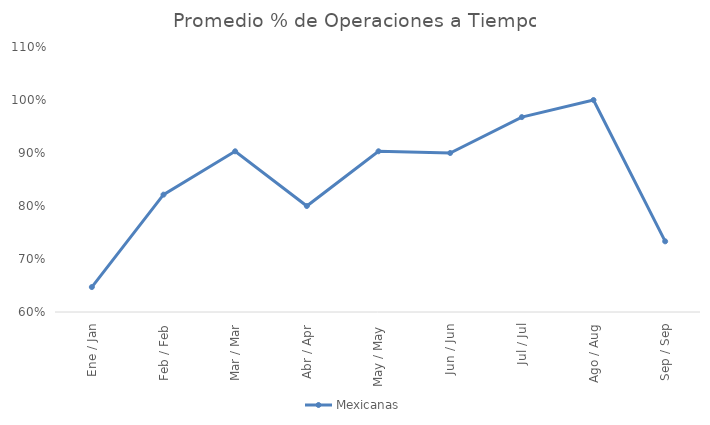
| Category | Mexicanas |
|---|---|
| Ene / Jan | 0.647 |
| Feb / Feb | 0.821 |
| Mar / Mar | 0.903 |
| Abr / Apr | 0.8 |
| May / May | 0.903 |
| Jun / Jun | 0.9 |
| Jul / Jul | 0.968 |
| Ago / Aug | 1 |
| Sep / Sep | 0.733 |